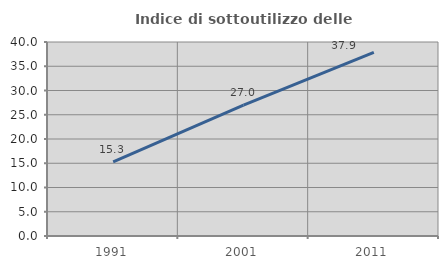
| Category | Indice di sottoutilizzo delle abitazioni  |
|---|---|
| 1991.0 | 15.297 |
| 2001.0 | 26.966 |
| 2011.0 | 37.864 |